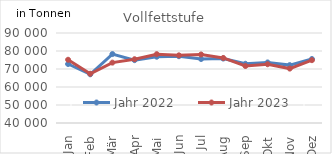
| Category | Jahr 2022 | Jahr 2023 |
|---|---|---|
| 0 | 72770.926 | 75134.552 |
| 1 | 67066.707 | 67353.925 |
| 2 | 78298.185 | 73543.314 |
| 3 | 74922.403 | 75431.358 |
| 4 | 76822.382 | 78233.352 |
| 5 | 77110.959 | 77584.371 |
| 6 | 75552.556 | 78058.733 |
| 7 | 75805.813 | 76140.84 |
| 8 | 72901.358 | 71670.296 |
| 9 | 73638.072 | 72646.549 |
| 10 | 72162.361 | 70234.044 |
| 11 | 75550.437 | 74913.159 |